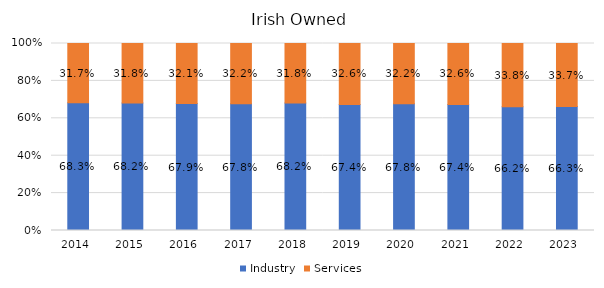
| Category | Industry | Services |
|---|---|---|
| 2014.0 | 0.683 | 0.317 |
| 2015.0 | 0.682 | 0.318 |
| 2016.0 | 0.679 | 0.321 |
| 2017.0 | 0.678 | 0.322 |
| 2018.0 | 0.682 | 0.318 |
| 2019.0 | 0.674 | 0.326 |
| 2020.0 | 0.678 | 0.322 |
| 2021.0 | 0.674 | 0.326 |
| 2022.0 | 0.662 | 0.338 |
| 2023.0 | 0.663 | 0.337 |